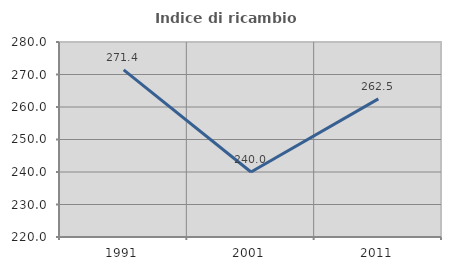
| Category | Indice di ricambio occupazionale  |
|---|---|
| 1991.0 | 271.429 |
| 2001.0 | 240 |
| 2011.0 | 262.5 |